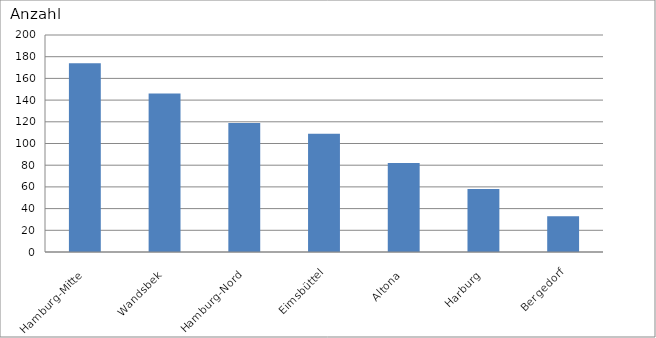
| Category | Hamburg-Mitte |
|---|---|
| Hamburg-Mitte | 174 |
| Wandsbek | 146 |
| Hamburg-Nord | 119 |
| Eimsbüttel | 109 |
| Altona | 82 |
| Harburg | 58 |
| Bergedorf | 33 |